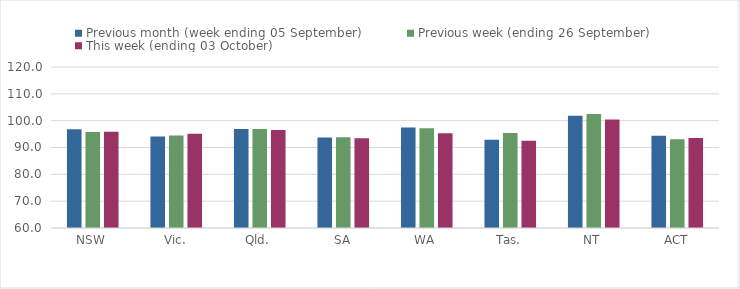
| Category | Previous month (week ending 05 September) | Previous week (ending 26 September) | This week (ending 03 October) |
|---|---|---|---|
| NSW | 96.77 | 95.77 | 95.84 |
| Vic. | 94.09 | 94.48 | 95.16 |
| Qld. | 96.94 | 96.91 | 96.5 |
| SA | 93.71 | 93.78 | 93.42 |
| WA | 97.42 | 97.15 | 95.35 |
| Tas. | 92.9 | 95.42 | 92.54 |
| NT | 101.87 | 102.44 | 100.43 |
| ACT | 94.42 | 93.1 | 93.52 |